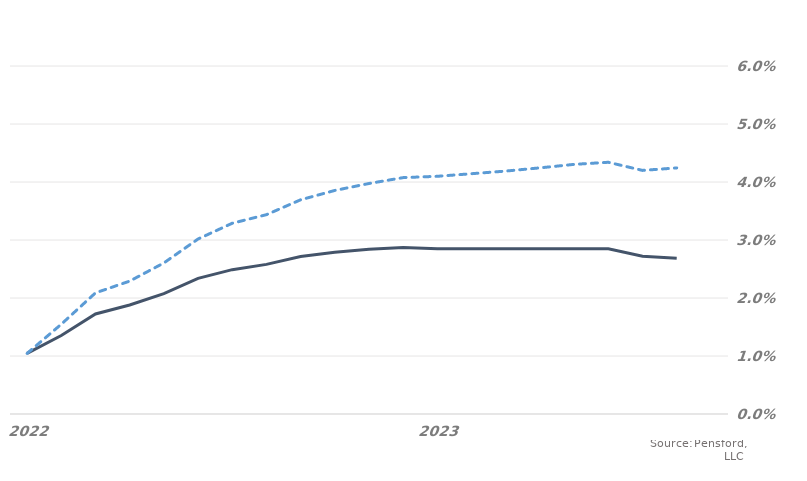
| Category | MARKET EXPECTATIONS | +1 Standard Deviation |
|---|---|---|
| 2022-05-31 | 0.01 | 0.01 |
| 2022-06-30 | 0.014 | 0.015 |
| 2022-07-30 | 0.017 | 0.021 |
| 2022-08-30 | 0.019 | 0.023 |
| 2022-09-30 | 0.021 | 0.026 |
| 2022-10-30 | 0.023 | 0.03 |
| 2022-11-30 | 0.025 | 0.033 |
| 2022-12-30 | 0.026 | 0.034 |
| 2023-01-30 | 0.027 | 0.037 |
| 2023-02-28 | 0.028 | 0.039 |
| 2023-03-28 | 0.028 | 0.04 |
| 2023-04-28 | 0.029 | 0.041 |
| 2023-05-28 | 0.029 | 0.041 |
| 2023-06-28 | 0.029 | 0.041 |
| 2023-07-28 | 0.029 | 0.042 |
| 2023-08-28 | 0.029 | 0.042 |
| 2023-09-28 | 0.029 | 0.043 |
| 2023-10-28 | 0.029 | 0.043 |
| 2023-11-28 | 0.027 | 0.042 |
| 2023-12-28 | 0.027 | 0.042 |
| 2024-01-28 | 0.027 | 0.043 |
| 2024-02-28 | 0.027 | 0.043 |
| 2024-03-28 | 0.027 | 0.044 |
| 2024-04-28 | 0.027 | 0.045 |
| 2024-05-28 | 0.025 | 0.044 |
| 2024-06-28 | 0.025 | 0.044 |
| 2024-07-28 | 0.025 | 0.044 |
| 2024-08-28 | 0.025 | 0.045 |
| 2024-09-28 | 0.025 | 0.045 |
| 2024-10-28 | 0.025 | 0.045 |
| 2024-11-28 | 0.025 | 0.046 |
| 2024-12-28 | 0.025 | 0.046 |
| 2025-01-28 | 0.025 | 0.046 |
| 2025-02-28 | 0.025 | 0.047 |
| 2025-03-28 | 0.025 | 0.047 |
| 2025-04-28 | 0.025 | 0.047 |
| 2025-05-28 | 0.024 | 0.046 |
| 2025-06-28 | 0.024 | 0.046 |
| 2025-07-28 | 0.024 | 0.047 |
| 2025-08-28 | 0.024 | 0.047 |
| 2025-09-28 | 0.024 | 0.047 |
| 2025-10-28 | 0.024 | 0.047 |
| 2025-11-28 | 0.024 | 0.048 |
| 2025-12-28 | 0.024 | 0.048 |
| 2026-01-28 | 0.024 | 0.048 |
| 2026-02-28 | 0.024 | 0.049 |
| 2026-03-28 | 0.024 | 0.048 |
| 2026-04-28 | 0.024 | 0.048 |
| 2026-05-28 | 0.024 | 0.047 |
| 2026-06-28 | 0.024 | 0.047 |
| 2026-07-28 | 0.024 | 0.047 |
| 2026-08-28 | 0.024 | 0.048 |
| 2026-09-28 | 0.024 | 0.048 |
| 2026-10-28 | 0.024 | 0.048 |
| 2026-11-28 | 0.024 | 0.048 |
| 2026-12-28 | 0.024 | 0.049 |
| 2027-01-28 | 0.024 | 0.049 |
| 2027-02-28 | 0.024 | 0.049 |
| 2027-03-28 | 0.024 | 0.049 |
| 2027-04-28 | 0.024 | 0.049 |
| 2027-05-28 | 0.025 | 0.049 |
| 2027-06-28 | 0.025 | 0.05 |
| 2027-07-28 | 0.025 | 0.05 |
| 2027-08-28 | 0.025 | 0.05 |
| 2027-09-28 | 0.025 | 0.05 |
| 2027-10-28 | 0.025 | 0.051 |
| 2027-11-28 | 0.025 | 0.051 |
| 2027-12-28 | 0.025 | 0.051 |
| 2028-01-28 | 0.025 | 0.051 |
| 2028-02-28 | 0.025 | 0.051 |
| 2028-03-28 | 0.025 | 0.051 |
| 2028-04-28 | 0.025 | 0.05 |
| 2028-05-28 | 0.025 | 0.049 |
| 2028-06-28 | 0.025 | 0.05 |
| 2028-07-28 | 0.025 | 0.05 |
| 2028-08-28 | 0.025 | 0.05 |
| 2028-09-28 | 0.025 | 0.05 |
| 2028-10-28 | 0.025 | 0.05 |
| 2028-11-28 | 0.025 | 0.051 |
| 2028-12-28 | 0.025 | 0.051 |
| 2029-01-28 | 0.025 | 0.051 |
| 2029-02-28 | 0.025 | 0.051 |
| 2029-03-28 | 0.025 | 0.051 |
| 2029-04-28 | 0.025 | 0.051 |
| 2029-05-28 | 0.025 | 0.052 |
| 2029-06-28 | 0.025 | 0.052 |
| 2029-07-28 | 0.025 | 0.052 |
| 2029-08-28 | 0.025 | 0.053 |
| 2029-09-28 | 0.025 | 0.053 |
| 2029-10-28 | 0.025 | 0.053 |
| 2029-11-28 | 0.025 | 0.053 |
| 2029-12-28 | 0.025 | 0.053 |
| 2030-01-28 | 0.025 | 0.053 |
| 2030-02-28 | 0.025 | 0.054 |
| 2030-03-28 | 0.025 | 0.053 |
| 2030-04-28 | 0.025 | 0.052 |
| 2030-05-28 | 0.026 | 0.053 |
| 2030-06-28 | 0.026 | 0.053 |
| 2030-07-28 | 0.026 | 0.053 |
| 2030-08-28 | 0.026 | 0.053 |
| 2030-09-28 | 0.026 | 0.053 |
| 2030-10-28 | 0.026 | 0.054 |
| 2030-11-28 | 0.026 | 0.054 |
| 2030-12-28 | 0.026 | 0.054 |
| 2031-01-28 | 0.026 | 0.054 |
| 2031-02-28 | 0.026 | 0.054 |
| 2031-03-28 | 0.026 | 0.054 |
| 2031-04-28 | 0.026 | 0.053 |
| 2031-05-28 | 0.027 | 0.054 |
| 2031-06-28 | 0.027 | 0.055 |
| 2031-07-28 | 0.027 | 0.055 |
| 2031-08-28 | 0.027 | 0.055 |
| 2031-09-28 | 0.027 | 0.055 |
| 2031-10-28 | 0.027 | 0.055 |
| 2031-11-28 | 0.027 | 0.055 |
| 2031-12-28 | 0.027 | 0.055 |
| 2032-01-28 | 0.027 | 0.056 |
| 2032-02-28 | 0.027 | 0.056 |
| 2032-03-28 | 0.027 | 0.055 |
| 2032-04-28 | 0.027 | 0.055 |